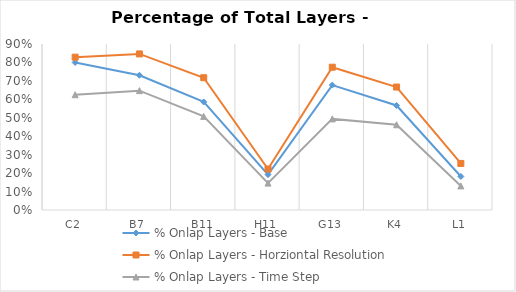
| Category | % Onlap Layers - Base | % Onlap Layers - Horziontal Resolution | % Onlap Layers - Time Step |
|---|---|---|---|
| C2 | 0.8 | 0.829 | 0.625 |
| B7 | 0.731 | 0.846 | 0.647 |
| B11 | 0.586 | 0.717 | 0.508 |
| H11 | 0.192 | 0.222 | 0.146 |
| G13 | 0.677 | 0.774 | 0.494 |
| K4 | 0.567 | 0.667 | 0.462 |
| L1 | 0.182 | 0.253 | 0.131 |